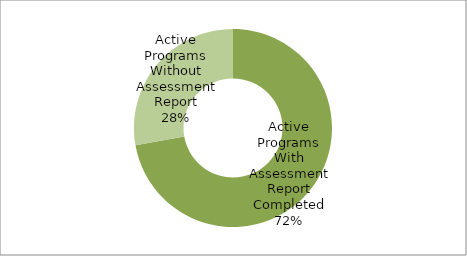
| Category | Series 0 |
|---|---|
| Active Programs With Assessment Report Completed | 39 |
| Active Programs Without Assessment Report | 15 |